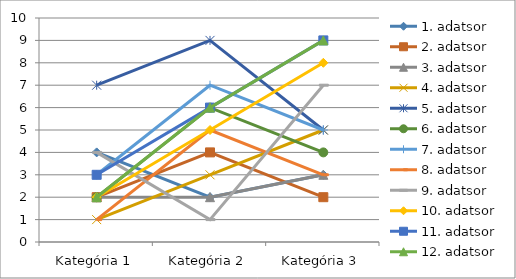
| Category | 1. adatsor | 2. adatsor | 3. adatsor | 4. adatsor | 5. adatsor | 6. adatsor | 7. adatsor | 8. adatsor | 9. adatsor | 10. adatsor | 11. adatsor | 12. adatsor |
|---|---|---|---|---|---|---|---|---|---|---|---|---|
| Kategória 1 | 4 | 2 | 2 | 1 | 7 | 2 | 3 | 1 | 4 | 2 | 3 | 2 |
| Kategória 2 | 2 | 4 | 2 | 3 | 9 | 6 | 7 | 5 | 1 | 5 | 6 | 6 |
| Kategória 3 | 3 | 2 | 3 | 5 | 5 | 4 | 5 | 3 | 7 | 8 | 9 | 9 |